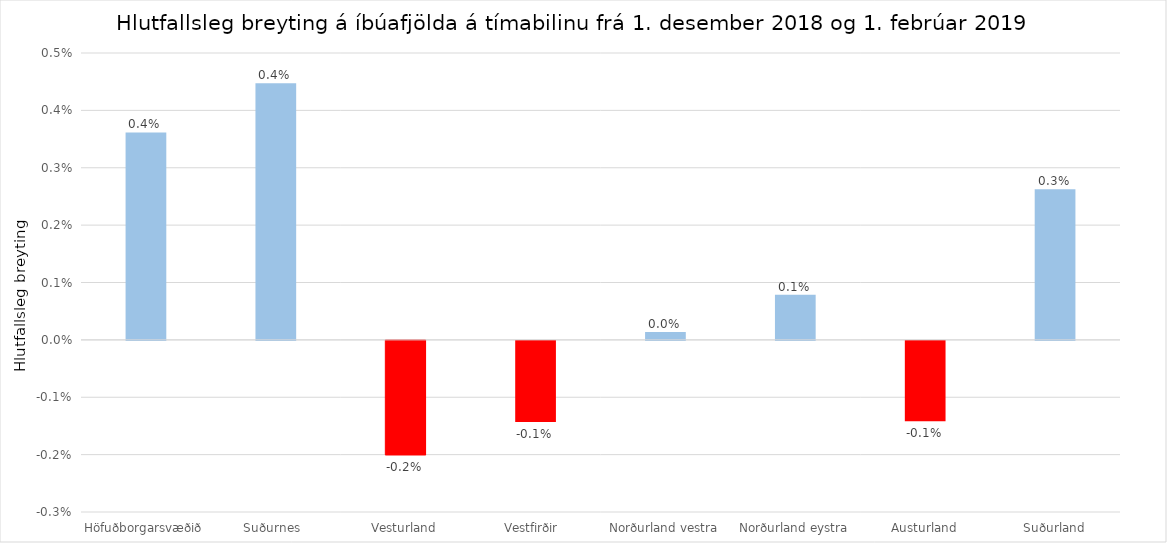
| Category | Series 0 |
|---|---|
| Höfuðborgarsvæðið | 0.004 |
| Suðurnes  | 0.004 |
| Vesturland | -0.002 |
| Vestfirðir  | -0.001 |
| Norðurland vestra | 0 |
| Norðurland eystra | 0.001 |
| Austurland | -0.001 |
| Suðurland | 0.003 |